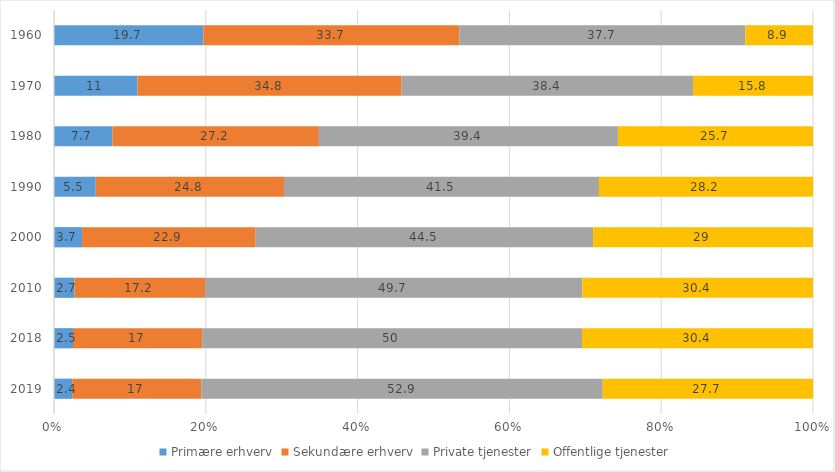
| Category | Primære erhverv | Sekundære erhverv | Private tjenester | Offentlige tjenester |
|---|---|---|---|---|
| 2019.0 | 2.4 | 17 | 52.9 | 27.7 |
| 2018.0 | 2.5 | 17 | 50 | 30.4 |
| 2010.0 | 2.7 | 17.2 | 49.7 | 30.4 |
| 2000.0 | 3.7 | 22.9 | 44.5 | 29 |
| 1990.0 | 5.5 | 24.8 | 41.5 | 28.2 |
| 1980.0 | 7.7 | 27.2 | 39.4 | 25.7 |
| 1970.0 | 11 | 34.8 | 38.4 | 15.8 |
| 1960.0 | 19.7 | 33.7 | 37.7 | 8.9 |